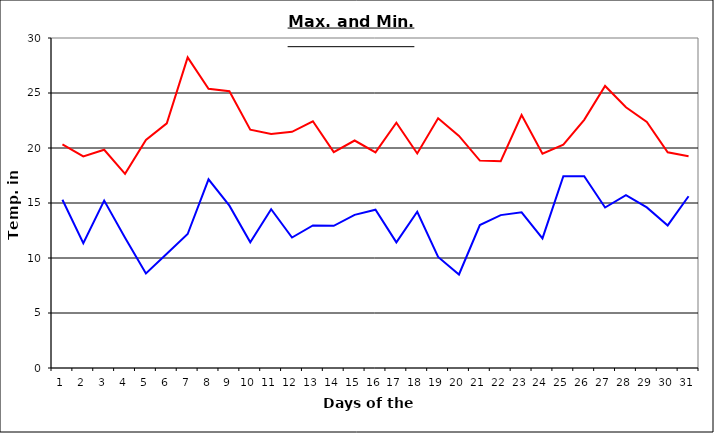
| Category | Series 0 | Series 1 |
|---|---|---|
| 0 | 20.32 | 15.3 |
| 1 | 19.23 | 11.35 |
| 2 | 19.84 | 15.22 |
| 3 | 17.65 | 11.85 |
| 4 | 20.73 | 8.59 |
| 5 | 22.24 | 10.39 |
| 6 | 28.24 | 12.18 |
| 7 | 25.39 | 17.15 |
| 8 | 25.16 | 14.76 |
| 9 | 21.67 | 11.43 |
| 10 | 21.27 | 14.44 |
| 11 | 21.47 | 11.86 |
| 12 | 22.43 | 12.96 |
| 13 | 19.62 | 12.93 |
| 14 | 20.68 | 13.92 |
| 15 | 19.6 | 14.39 |
| 16 | 22.3 | 11.42 |
| 17 | 19.5 | 14.2 |
| 18 | 22.7 | 10.1 |
| 19 | 21.1 | 8.5 |
| 20 | 18.86 | 13 |
| 21 | 18.8 | 13.9 |
| 22 | 23 | 14.15 |
| 23 | 19.49 | 11.78 |
| 24 | 20.3 | 17.43 |
| 25 | 22.56 | 17.43 |
| 26 | 25.64 | 14.59 |
| 27 | 23.7 | 15.72 |
| 28 | 22.36 | 14.6 |
| 29 | 19.61 | 12.96 |
| 30 | 19.25 | 15.61 |